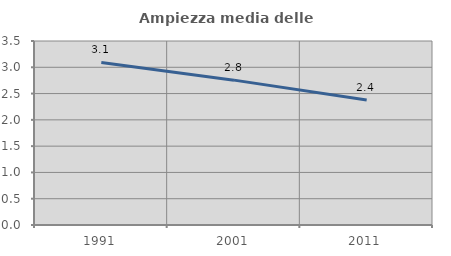
| Category | Ampiezza media delle famiglie |
|---|---|
| 1991.0 | 3.091 |
| 2001.0 | 2.755 |
| 2011.0 | 2.376 |